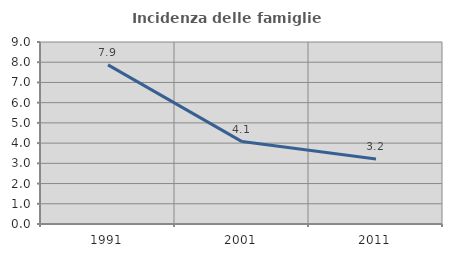
| Category | Incidenza delle famiglie numerose |
|---|---|
| 1991.0 | 7.869 |
| 2001.0 | 4.076 |
| 2011.0 | 3.213 |